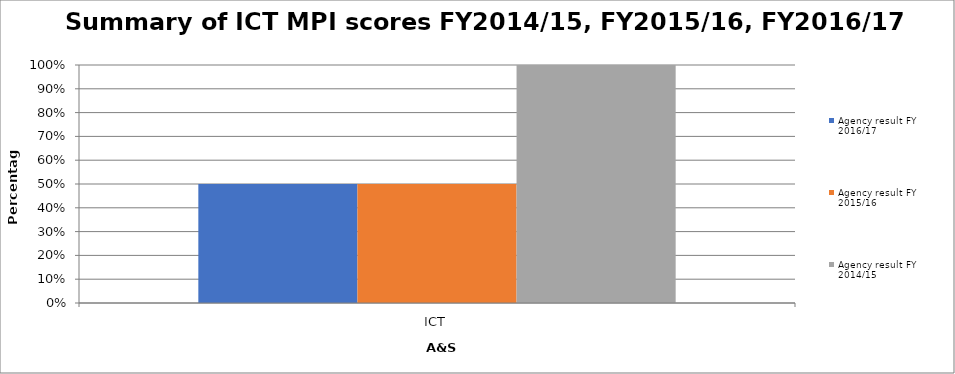
| Category | Agency result FY 2016/17  | Agency result FY 2015/16  | Agency result FY 2014/15  |
|---|---|---|---|
| ICT | 0.5 | 0.5 | 1 |